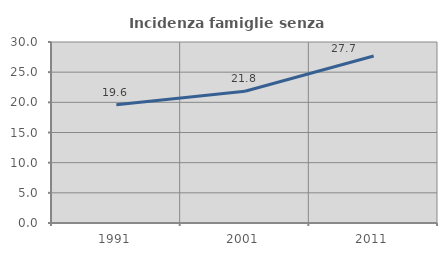
| Category | Incidenza famiglie senza nuclei |
|---|---|
| 1991.0 | 19.581 |
| 2001.0 | 21.839 |
| 2011.0 | 27.683 |